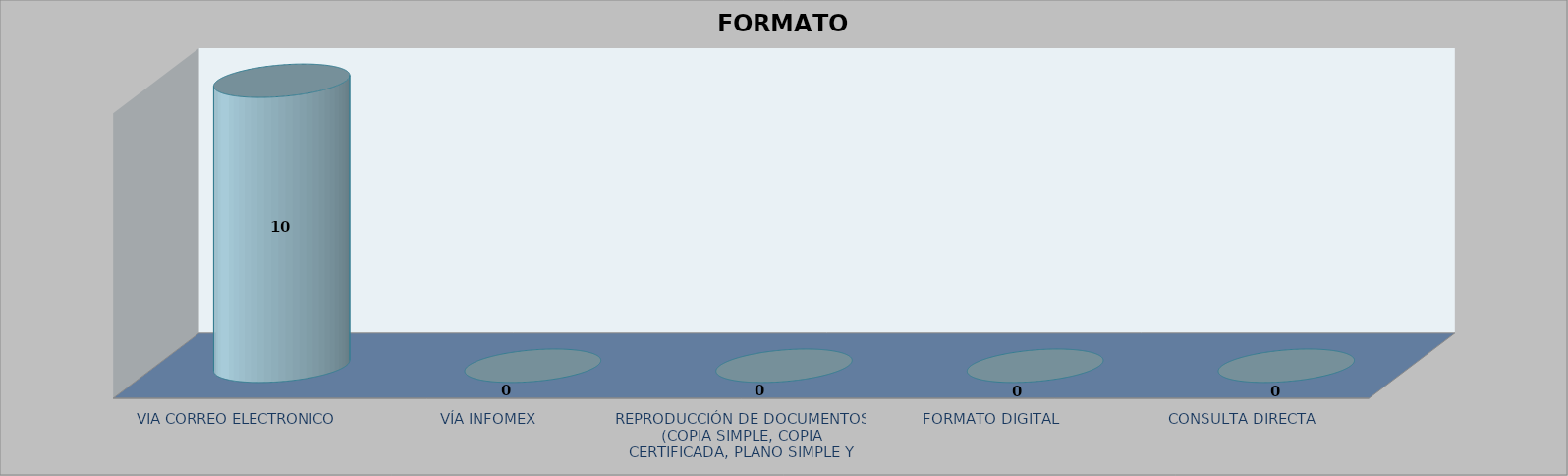
| Category |        FORMATO SOLICITADO | Series 1 | Series 2 |
|---|---|---|---|
| VIA CORREO ELECTRONICO |  |  | 10 |
| VÍA INFOMEX |  |  | 0 |
| REPRODUCCIÓN DE DOCUMENTOS (COPIA SIMPLE, COPIA CERTIFICADA, PLANO SIMPLE Y PLANO CERTIFICADO) |  |  | 0 |
| FORMATO DIGITAL |  |  | 0 |
| CONSULTA DIRECTA |  |  | 0 |